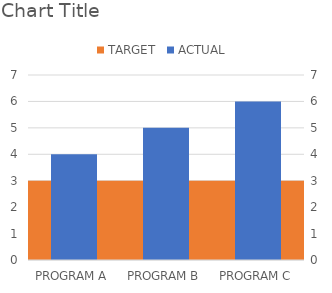
| Category | TARGET |
|---|---|
| PROGRAM A | 3 |
| PROGRAM B | 3 |
| PROGRAM C | 3 |